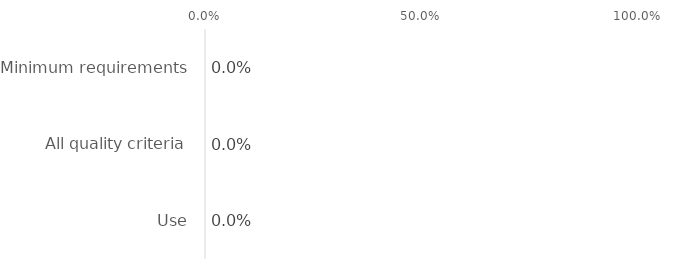
| Category | Series 0 |
|---|---|
| Minimum requirements | 0 |
| All quality criteria | 0 |
| Use | 0 |